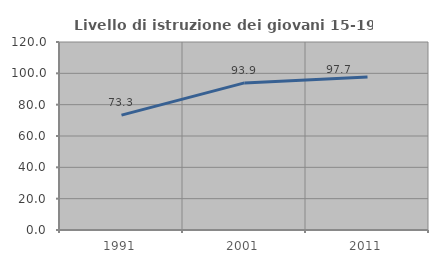
| Category | Livello di istruzione dei giovani 15-19 anni |
|---|---|
| 1991.0 | 73.311 |
| 2001.0 | 93.908 |
| 2011.0 | 97.716 |